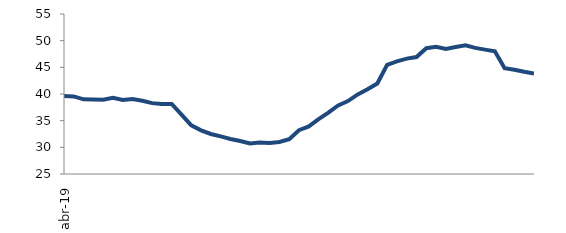
| Category | Series 0 |
|---|---|
| 2019-04-01 | 39.625 |
| 2019-05-01 | 39.543 |
| 2019-06-01 | 38.994 |
| 2019-07-01 | 38.99 |
| 2019-08-01 | 38.936 |
| 2019-09-01 | 39.294 |
| 2019-10-01 | 38.876 |
| 2019-11-01 | 39.061 |
| 2019-12-01 | 38.744 |
| 2020-01-01 | 38.288 |
| 2020-02-01 | 38.128 |
| 2020-03-01 | 38.143 |
| 2020-04-01 | 36.141 |
| 2020-05-01 | 34.114 |
| 2020-06-01 | 33.191 |
| 2020-07-01 | 32.506 |
| 2020-08-01 | 32.045 |
| 2020-09-01 | 31.572 |
| 2020-10-01 | 31.184 |
| 2020-11-01 | 30.726 |
| 2020-12-01 | 30.899 |
| 2021-01-01 | 30.834 |
| 2021-02-01 | 30.995 |
| 2021-03-01 | 31.535 |
| 2021-04-01 | 33.22 |
| 2021-05-01 | 33.912 |
| 2021-06-01 | 35.282 |
| 2021-07-01 | 36.501 |
| 2021-08-01 | 37.863 |
| 2021-09-01 | 38.674 |
| 2021-10-01 | 39.929 |
| 2021-11-01 | 40.877 |
| 2021-12-01 | 41.971 |
| 2022-01-01 | 45.477 |
| 2022-02-01 | 46.119 |
| 2022-03-01 | 46.637 |
| 2022-04-01 | 46.937 |
| 2022-05-01 | 48.594 |
| 2022-06-01 | 48.846 |
| 2022-07-01 | 48.431 |
| 2022-08-01 | 48.822 |
| 2022-09-01 | 49.123 |
| 2022-10-01 | 48.644 |
| 2022-11-01 | 48.315 |
| 2022-12-01 | 48.003 |
| 2023-01-01 | 44.844 |
| 2023-02-01 | 44.552 |
| 2023-03-01 | 44.166 |
| 2023-04-01 | 43.838 |